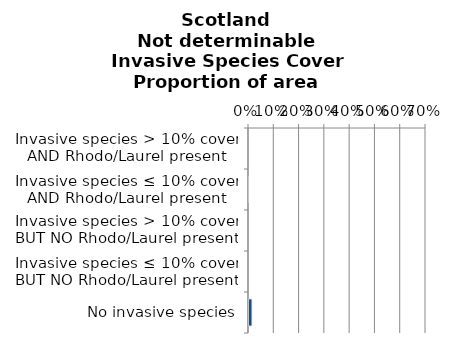
| Category | Not determinable |
|---|---|
| No invasive species | 0.012 |
| Invasive species ≤ 10% cover BUT NO Rhodo/Laurel present | 0 |
| Invasive species > 10% cover BUT NO Rhodo/Laurel present | 0 |
| Invasive species ≤ 10% cover AND Rhodo/Laurel present | 0 |
| Invasive species > 10% cover AND Rhodo/Laurel present | 0 |